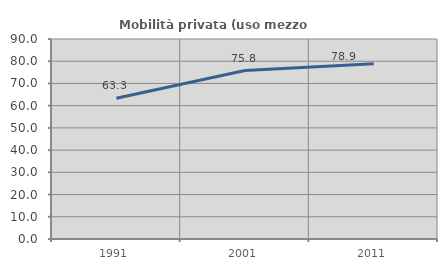
| Category | Mobilità privata (uso mezzo privato) |
|---|---|
| 1991.0 | 63.345 |
| 2001.0 | 75.807 |
| 2011.0 | 78.871 |